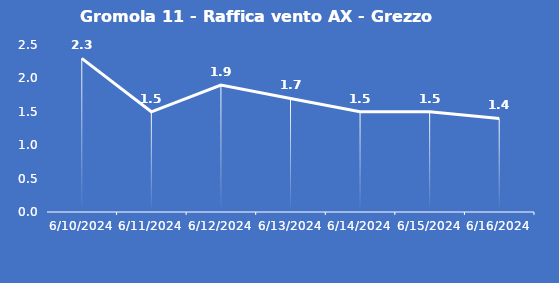
| Category | Gromola 11 - Raffica vento AX - Grezzo (m/s) |
|---|---|
| 6/10/24 | 2.3 |
| 6/11/24 | 1.5 |
| 6/12/24 | 1.9 |
| 6/13/24 | 1.7 |
| 6/14/24 | 1.5 |
| 6/15/24 | 1.5 |
| 6/16/24 | 1.4 |